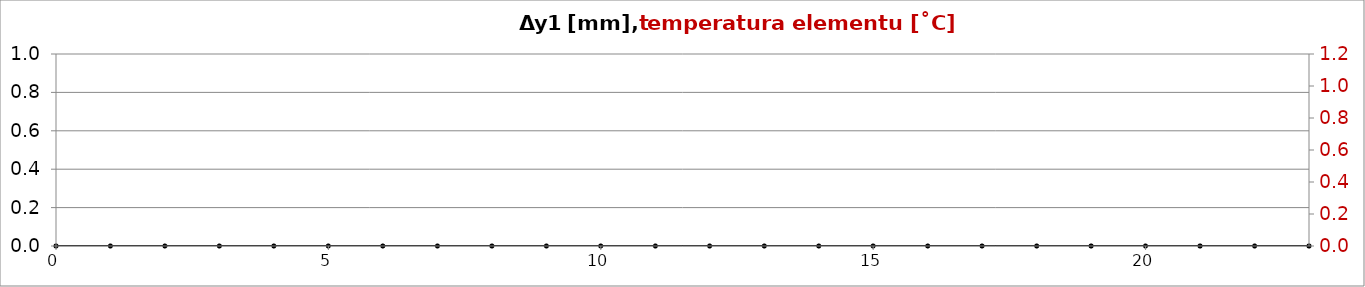
| Category | dy1 |
|---|---|
| 0.0 | 0 |
| 1.0 | 0 |
| 2.0 | 0 |
| 3.0 | 0 |
| 4.0 | 0 |
| 5.0 | 0 |
| 6.0 | 0 |
| 7.0 | 0 |
| 8.0 | 0 |
| 9.0 | 0 |
| 10.0 | 0 |
| 11.0 | 0 |
| 12.0 | 0 |
| 13.0 | 0 |
| 14.0 | 0 |
| 15.0 | 0 |
| 16.0 | 0 |
| 17.0 | 0 |
| 18.0 | 0 |
| 19.0 | 0 |
| 20.0 | 0 |
| 21.0 | 0 |
| 22.0 | 0 |
| 23.0 | 0 |